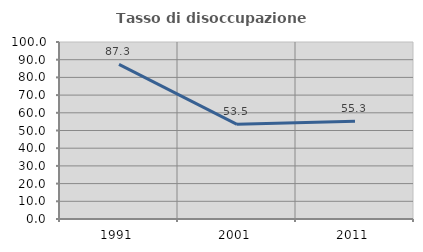
| Category | Tasso di disoccupazione giovanile  |
|---|---|
| 1991.0 | 87.346 |
| 2001.0 | 53.488 |
| 2011.0 | 55.294 |